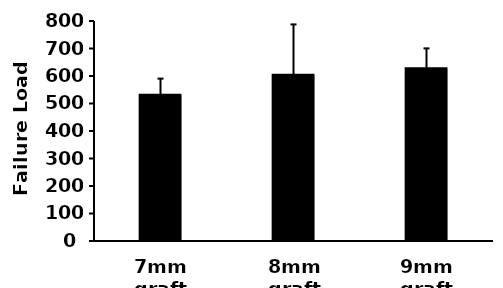
| Category | Failure Load |
|---|---|
| 7mm graft | 531.571 |
| 8mm graft | 604.139 |
| 9mm graft | 627.946 |